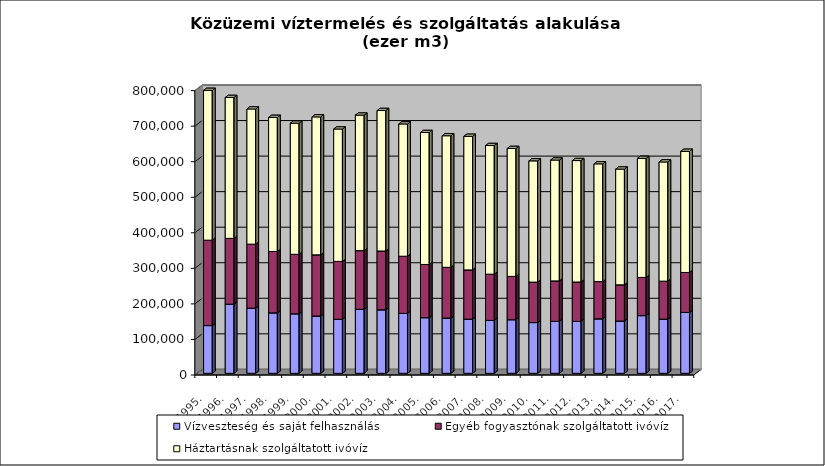
| Category | Vízveszteség és saját felhasználás | Egyéb fogyasztónak szolgáltatott ivóvíz  | Háztartásnak szolgáltatott ivóvíz  |
|---|---|---|---|
| 1995. | 134317.9 | 240229.5 | 421389.3 |
| 1996. | 194412.2 | 185202.2 | 396295 |
| 1997. | 183305.6 | 180066.8 | 380276.6 |
| 1998. | 170139.1 | 172565.8 | 377209.8 |
| 1999. | 167511.9 | 167288.2 | 368726.7 |
| 2000. | 161258.6 | 172041.1 | 388062.2 |
| 2001. | 152181.2 | 162568.9 | 372445.4 |
| 2002. | 180010.5 | 165145.7 | 381181.5 |
| 2003. | 178688.6 | 165400.1 | 395187.8 |
| 2004. | 168629.1 | 160799.6 | 372022.3 |
| 2005. | 156533.6 | 149677.7 | 371162.9 |
| 2006. | 155468.2 | 142709.4 | 370143.4 |
| 2007. | 152327.7 | 138624 | 375656.3 |
| 2008. | 148912.9 | 130022.1 | 361802.6 |
| 2009. | 150823 | 121893.5 | 359779.1 |
| 2010. | 142767.3 | 113808.6 | 341079.3 |
| 2011. | 146221 | 113813.8 | 339940 |
| 2012. | 146085.7 | 110794.4 | 341571.6 |
| 2013. | 153248 | 104873.2 | 331191.3 |
| 2014. | 147005.7 | 101887.5 | 325613.9 |
| 2015. | 162371.53 | 107394.19 | 334765.48 |
| 2016. | 152399.35 | 106820.29 | 335449.76 |
| 2017. | 171321.05 | 112349.13 | 340787.12 |